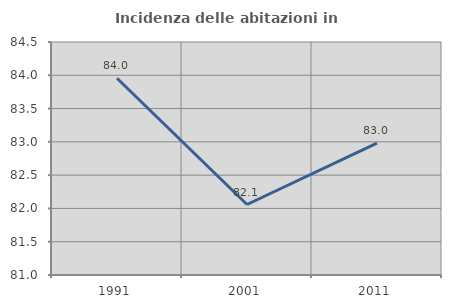
| Category | Incidenza delle abitazioni in proprietà  |
|---|---|
| 1991.0 | 83.956 |
| 2001.0 | 82.059 |
| 2011.0 | 82.982 |